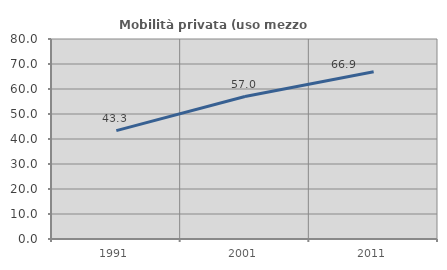
| Category | Mobilità privata (uso mezzo privato) |
|---|---|
| 1991.0 | 43.348 |
| 2001.0 | 56.997 |
| 2011.0 | 66.873 |